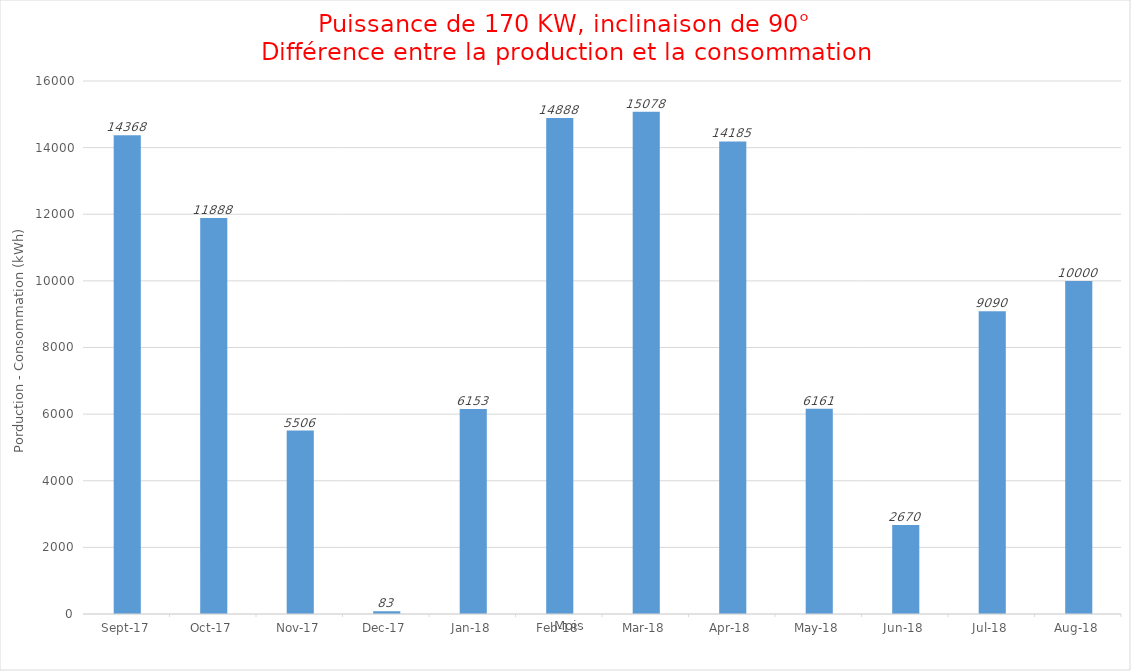
| Category | Series 0 |
|---|---|
| 2017-09-01 | 14368 |
| 2017-10-01 | 11888 |
| 2017-11-01 | 5506 |
| 2017-12-01 | 83 |
| 2018-01-01 | 6153 |
| 2018-02-01 | 14888 |
| 2018-03-01 | 15078 |
| 2018-04-01 | 14185 |
| 2018-05-01 | 6161 |
| 2018-06-01 | 2670 |
| 2018-07-01 | 9090 |
| 2018-08-01 | 10000 |